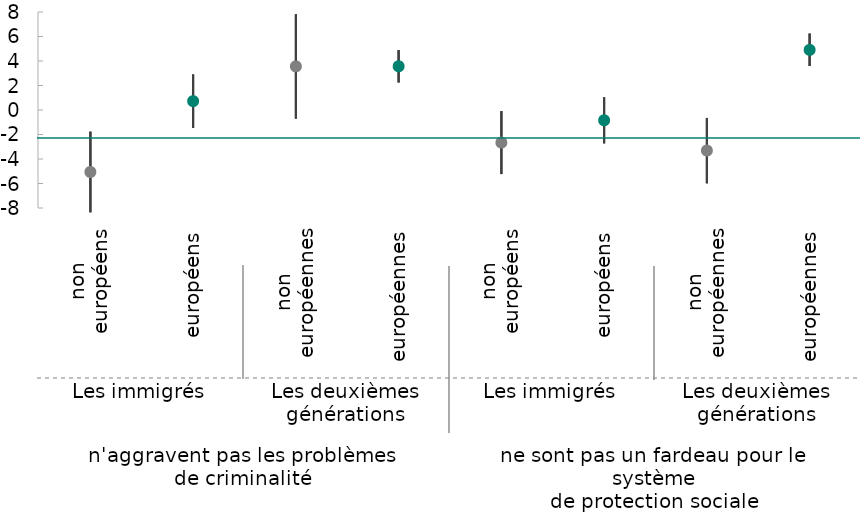
| Category | Maximum | Minimum | Immigrés  |
|---|---|---|---|
| 0 | -1.77 | -8.35 | -5.06 |
| 1 | -1.46 | 2.9 | 0.72 |
| 2 | -0.7 | 7.81 | 3.56 |
| 3 | 2.25 | 4.89 | 3.57 |
| 4 | -5.23 | -0.09 | -2.66 |
| 5 | -2.72 | 1.04 | -0.84 |
| 6 | -5.98 | -0.65 | -3.31 |
| 7 | 3.59 | 6.24 | 4.91 |